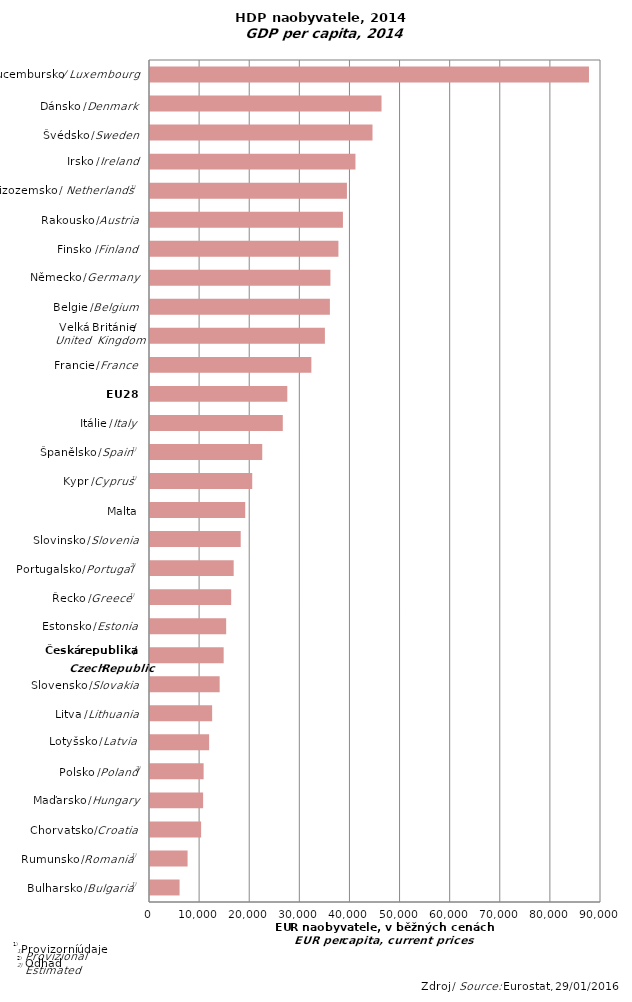
| Category | Series 0 |
|---|---|
|  | 5900 |
|  | 7500 |
|  | 10200 |
|  | 10600 |
|  | 10700 |
|  | 11800 |
|  | 12400 |
|  | 13900 |
|  | 14700 |
|  | 15200 |
|  | 16200 |
|  | 16700 |
|  | 18100 |
|  | 19000 |
|  | 20400 |
|  | 22400 |
|  | 26500 |
|  | 27400 |
|  | 32200 |
|  | 34900 |
|  | 35900 |
|  | 36000 |
|  | 37600 |
|  | 38500 |
|  | 39300 |
|  | 41000 |
|  | 44400 |
|  | 46200 |
|  | 87600 |